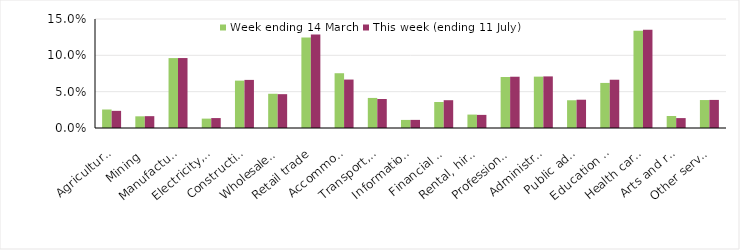
| Category | Week ending 14 March | This week (ending 11 July) |
|---|---|---|
| Agriculture, forestry and fishing | 0.025 | 0.024 |
| Mining | 0.016 | 0.016 |
| Manufacturing | 0.096 | 0.096 |
| Electricity, gas, water and waste services | 0.013 | 0.014 |
| Construction | 0.065 | 0.066 |
| Wholesale trade | 0.047 | 0.047 |
| Retail trade | 0.125 | 0.129 |
| Accommodation and food services | 0.075 | 0.067 |
| Transport, postal and warehousing | 0.041 | 0.04 |
| Information media and telecommunications | 0.011 | 0.011 |
| Financial and insurance services | 0.036 | 0.038 |
| Rental, hiring and real estate services | 0.018 | 0.018 |
| Professional, scientific and technical services | 0.07 | 0.071 |
| Administrative and support services | 0.071 | 0.071 |
| Public administration and safety | 0.038 | 0.039 |
| Education and training | 0.062 | 0.066 |
| Health care and social assistance | 0.134 | 0.135 |
| Arts and recreation services | 0.016 | 0.014 |
| Other services | 0.038 | 0.039 |